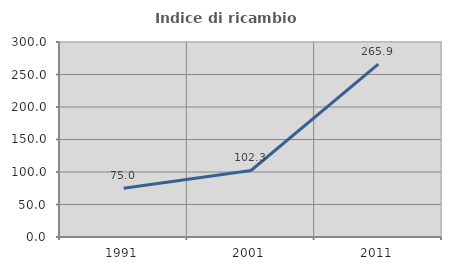
| Category | Indice di ricambio occupazionale  |
|---|---|
| 1991.0 | 74.966 |
| 2001.0 | 102.329 |
| 2011.0 | 265.854 |